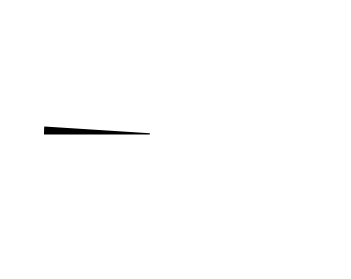
| Category | Series 0 |
|---|---|
| 0 | 0 |
| 1 | 0 |
| 2 | 2 |
| 3 | 99 |
| 4 | -1 |
| 5 | 0 |
| 6 | 0 |
| 7 | 0 |
| 8 | 0 |
| 9 | 0 |
| 10 | 100 |